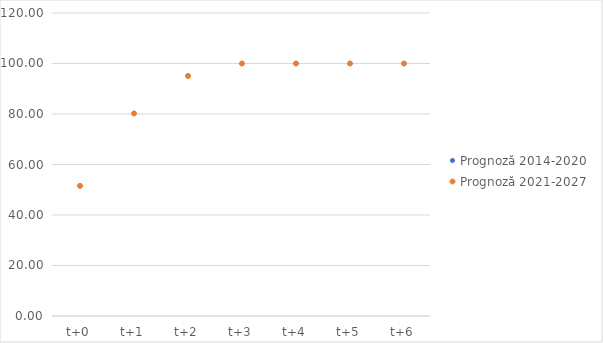
| Category | Prognoză 2014-2020 | Prognoză 2021-2027 |
|---|---|---|
| t+0 | 51.541 | 51.541 |
| t+1 | 80.228 | 80.228 |
| t+2 | 95.079 | 95.079 |
| t+3 | 100 | 100 |
| t+4 | 100 | 100 |
| t+5 | 100 | 100 |
| t+6 | 100 | 100 |